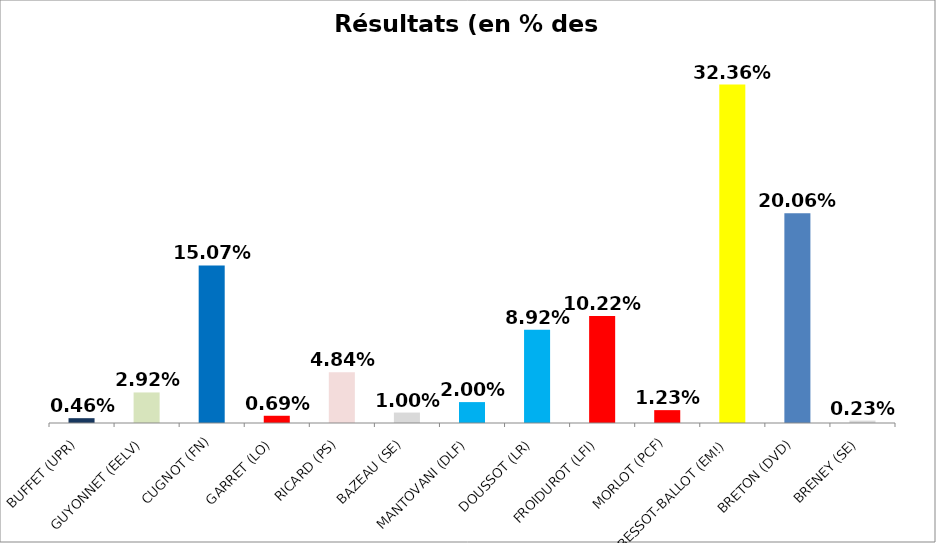
| Category | Résultats |
|---|---|
| BUFFET (UPR) | 0.005 |
| GUYONNET (EELV) | 0.029 |
| CUGNOT (FN) | 0.151 |
| GARRET (LO) | 0.007 |
| RICARD (PS) | 0.048 |
| BAZEAU (SE) | 0.01 |
| MANTOVANI (DLF) | 0.02 |
| DOUSSOT (LR) | 0.089 |
| FROIDUROT (LFI) | 0.102 |
| MORLOT (PCF) | 0.012 |
| BESSOT-BALLOT (EM!) | 0.324 |
| BRETON (DVD) | 0.201 |
| BRENEY (SE) | 0.002 |